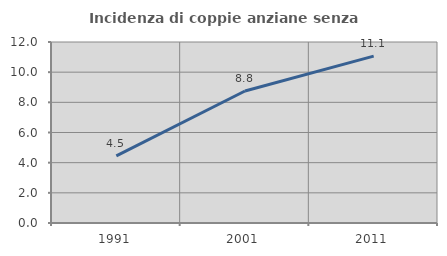
| Category | Incidenza di coppie anziane senza figli  |
|---|---|
| 1991.0 | 4.453 |
| 2001.0 | 8.753 |
| 2011.0 | 11.061 |